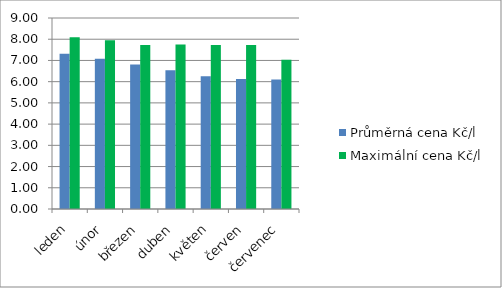
| Category | Průměrná cena Kč/l | Maximální cena Kč/l |
|---|---|---|
| leden | 7.32 | 8.09 |
| únor | 7.08 | 7.95 |
| březen | 6.81 | 7.73 |
| duben | 6.54 | 7.75 |
| květen | 6.25 | 7.73 |
| červen | 6.12 | 7.73 |
| červenec | 6.1 | 7.03 |